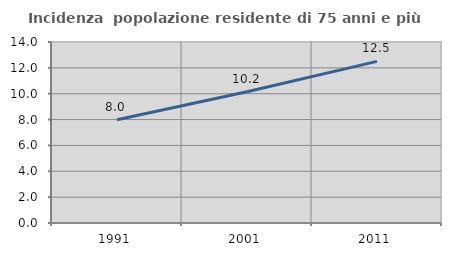
| Category | Incidenza  popolazione residente di 75 anni e più |
|---|---|
| 1991.0 | 7.983 |
| 2001.0 | 10.154 |
| 2011.0 | 12.504 |